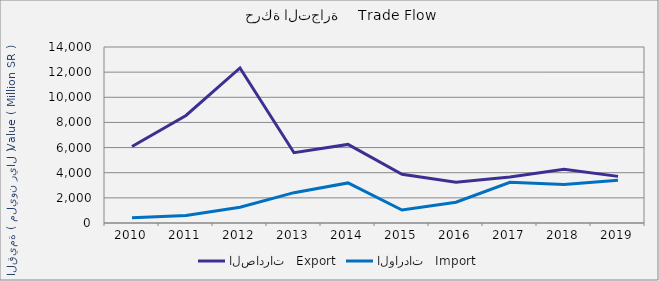
| Category | الصادرات   Export | الواردات   Import |
|---|---|---|
| 2010.0 | 6081962607 | 417857171 |
| 2011.0 | 8554540626 | 601296836 |
| 2012.0 | 12330640713 | 1258086376 |
| 2013.0 | 5591188994 | 2413286054 |
| 2014.0 | 6250692173 | 3189394202 |
| 2015.0 | 3879452567 | 1031724746 |
| 2016.0 | 3244019708 | 1649495807 |
| 2017.0 | 3660535280 | 3235212966 |
| 2018.0 | 4267886782 | 3059140878 |
| 2019.0 | 3708156382 | 3406169816 |